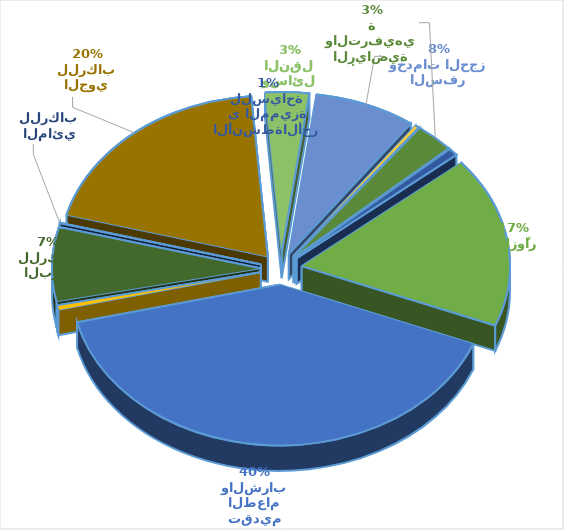
| Category | Series 0 |
|---|---|
| الإقامة للزوّار | 2996197 |
| نشاط تقديم الطعام والشراب | 7031933 |
| نقل الركاب بالسكك الحديدية | 81689 |
| النقل البري للركاب | 1299888 |
| النقل المائي للركاب | 8407 |
| النقل الجوي للركاب | 3417073 |
| استئجار وسائل النقل | 592267 |
| وكالات السفر وخدمات الحجز | 1372450 |
| الأنشطة الثقافية | 54626 |
| الأنشطة الرياضية والترفيهية | 514056 |
| الأنشطةالأخرى المميزة للسياحة | 118042 |